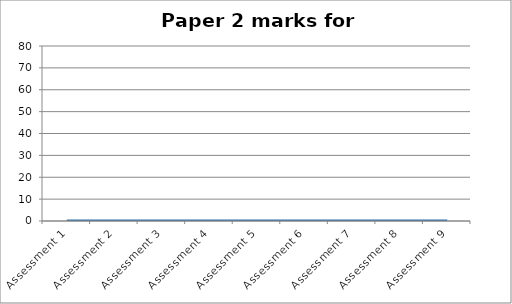
| Category | Series 0 |
|---|---|
| Assessment 1 | 0 |
| Assessment 2 | 0 |
| Assessment 3 | 0 |
| Assessment 4 | 0 |
| Assessment 5 | 0 |
| Assessment 6 | 0 |
| Assessment 7 | 0 |
| Assessment 8 | 0 |
| Assessment 9 | 0 |